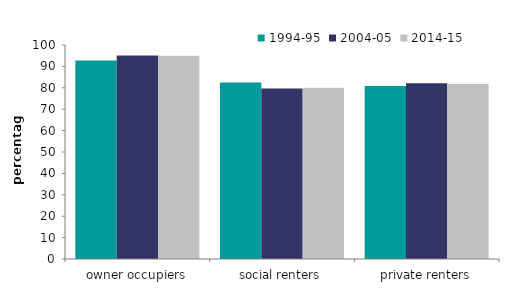
| Category | 1994-95 | 2004-05 | 2014-15 |
|---|---|---|---|
| owner occupiers | 92.742 | 95.089 | 95.006 |
| social renters | 82.506 | 79.712 | 79.987 |
| private renters | 80.895 | 82.176 | 81.809 |